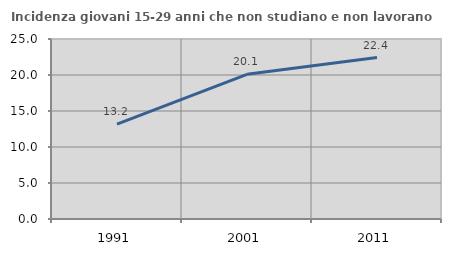
| Category | Incidenza giovani 15-29 anni che non studiano e non lavorano  |
|---|---|
| 1991.0 | 13.187 |
| 2001.0 | 20.091 |
| 2011.0 | 22.426 |